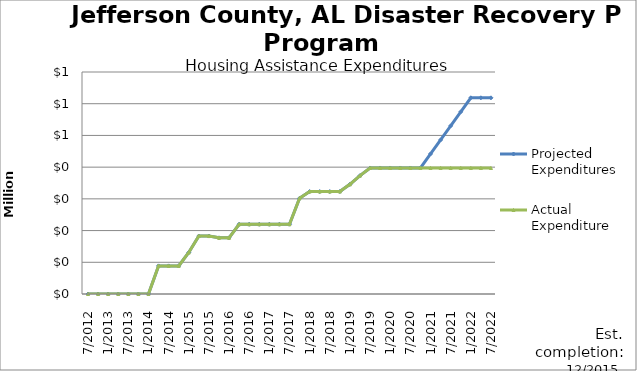
| Category | Projected Expenditures | Actual Expenditure |
|---|---|---|
| 7/2012 | 0 | 0 |
| 10/2012 | 0 | 0 |
| 1/2013 | 0 | 0 |
| 4/2013 | 0 | 0 |
| 7/2013 | 0 | 0 |
| 10/2013 | 0 | 0 |
| 1/2014 | 0 | 0 |
| 4/2014 | 88640 | 88640.38 |
| 7/2014 | 88640 | 88640.38 |
| 10/2014 | 88640 | 88640.38 |
| 1/2015 | 130846 | 130846.41 |
| 4/2015 | 182781 | 182781.53 |
| 7/2015 | 182781 | 182781.53 |
| 10/2015 | 177116 | 177116.43 |
| 1/2016 | 177116 | 177116.43 |
| 4/2016 | 219906 | 219906.33 |
| 7/2016 | 219906 | 219906.33 |
| 10/2016 | 219906 | 219906.33 |
| 1/2017 | 219906 | 219906.33 |
| 4/2017 | 220033 | 220033.5 |
| 7/2017 | 220033 | 220033.5 |
| 10/2017 | 301933 | 301933.5 |
| 1/2018 | 323033 | 323033.5 |
| 4/2018 | 323033 | 323033.5 |
| 7/2018 | 323033 | 323033.5 |
| 10/2018 | 323033 | 323033.5 |
| 1/2019 | 345872.5 | 345873 |
| 4/2019 | 373280.63 | 373281.13 |
| 7/2019 | 397302.63 | 397303.13 |
| 10/2019 | 397302.63 | 397303.13 |
| 1/2020 | 397302.63 | 397303.13 |
| 4/2020 | 397302.63 | 397303.13 |
| 7/2020 | 397302.63 | 397303.13 |
| 10/2020 | 397302.63 | 397303.13 |
| 1/2021 | 441562.03 | 397303.13 |
| 4/2021 | 485821.43 | 397303.13 |
| 7/2021 | 530080.83 | 397303.13 |
| 10/2021 | 574340.23 | 397303.13 |
| 1/2022 | 618599.63 | 397303.13 |
| 4/2022 | 618599.63 | 397303.13 |
| 7/2022 | 618599.63 | 397303.13 |